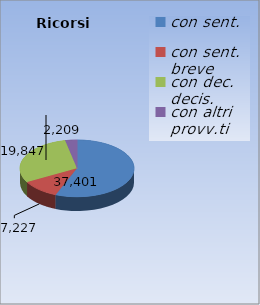
| Category | Ricorsi definiti |
|---|---|
| con sent. | 37401 |
| con sent. breve | 7227 |
| con dec. decis. | 19847 |
| con altri provv.ti | 2209 |